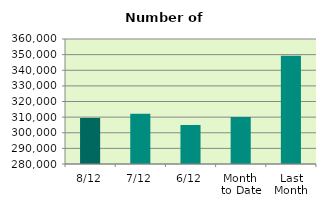
| Category | Series 0 |
|---|---|
| 8/12 | 309514 |
| 7/12 | 312108 |
| 6/12 | 304950 |
| Month 
to Date | 310121.333 |
| Last
Month | 349295 |